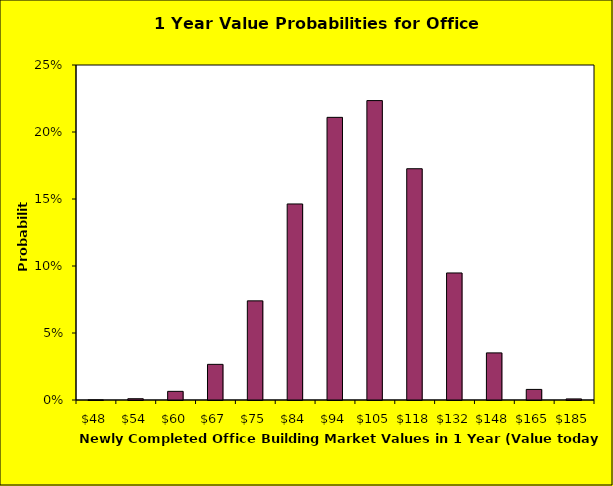
| Category | Series 1 |
|---|---|
| 48.02690759720768 | 0 |
| 53.732666895117 | 0.001 |
| 60.11628972400183 | 0.006 |
| 67.25830856738197 | 0.027 |
| 75.24882344059657 | 0.074 |
| 84.18863854599144 | 0.146 |
| 94.19053396659199 | 0.211 |
| 105.38068844129253 | 0.223 |
| 117.90027117055712 | 0.173 |
| 131.90722273402918 | 0.095 |
| 147.57824758718542 | 0.035 |
| 165.1110432733416 | 0.008 |
| 184.7267944735948 | 0.001 |